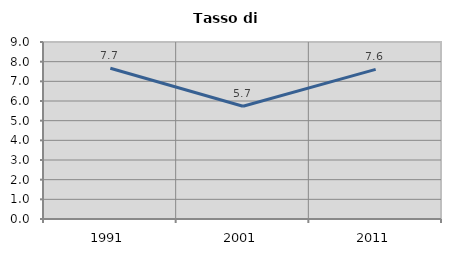
| Category | Tasso di disoccupazione   |
|---|---|
| 1991.0 | 7.668 |
| 2001.0 | 5.731 |
| 2011.0 | 7.606 |